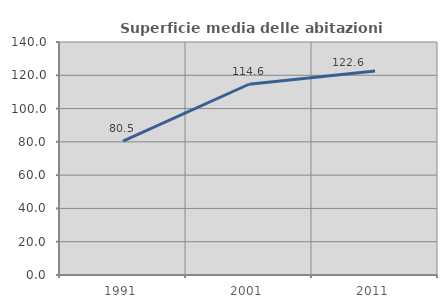
| Category | Superficie media delle abitazioni occupate |
|---|---|
| 1991.0 | 80.486 |
| 2001.0 | 114.611 |
| 2011.0 | 122.578 |